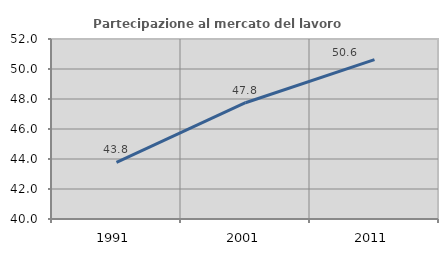
| Category | Partecipazione al mercato del lavoro  femminile |
|---|---|
| 1991.0 | 43.775 |
| 2001.0 | 47.751 |
| 2011.0 | 50.62 |